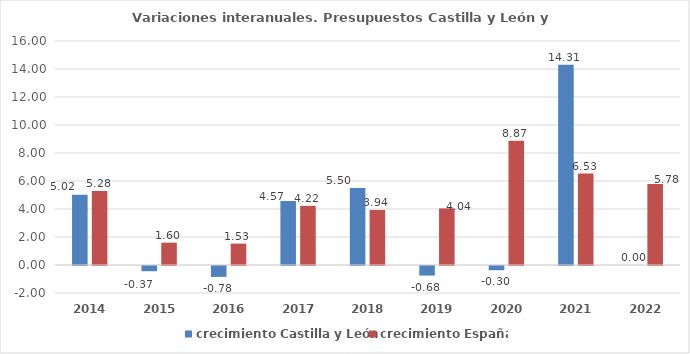
| Category | crecimiento Castilla y León | crecimiento España |
|---|---|---|
| 2014.0 | 5.022 | 5.284 |
| 2015.0 | -0.371 | 1.597 |
| 2016.0 | -0.777 | 1.528 |
| 2017.0 | 4.566 | 4.224 |
| 2018.0 | 5.499 | 3.935 |
| 2019.0 | -0.684 | 4.044 |
| 2020.0 | -0.3 | 8.87 |
| 2021.0 | 14.311 | 6.531 |
| 2022.0 | 0 | 5.78 |